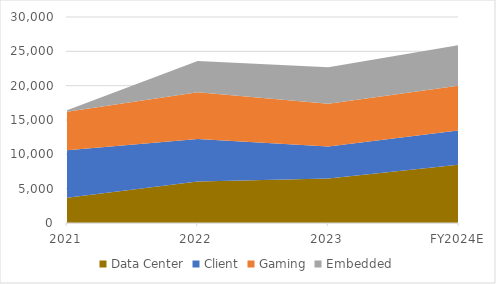
| Category | Data Center | Client | Gaming | Embedded |
|---|---|---|---|---|
| 2021 | 3694 | 6887 | 5607 | 246 |
| 2022 | 6043 | 6201 | 6805 | 4552 |
| 2023 | 6496 | 4651 | 6212 | 5321 |
| FY2024E | 8509.76 | 4976.57 | 6522.6 | 5906.31 |